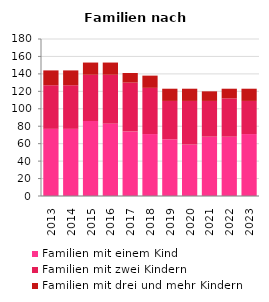
| Category | Familien mit einem Kind | Familien mit zwei Kindern | Familien mit drei und mehr Kindern |
|---|---|---|---|
| 2013.0 | 77 | 50 | 17 |
| 2014.0 | 77 | 50 | 17 |
| 2015.0 | 86 | 53 | 14 |
| 2016.0 | 83 | 56 | 14 |
| 2017.0 | 74 | 56 | 11 |
| 2018.0 | 71 | 53 | 14 |
| 2019.0 | 65 | 44 | 14 |
| 2020.0 | 59 | 50 | 14 |
| 2021.0 | 68 | 41 | 11 |
| 2022.0 | 68 | 44 | 11 |
| 2023.0 | 71 | 38 | 14 |